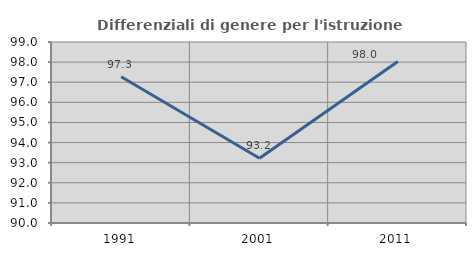
| Category | Differenziali di genere per l'istruzione superiore |
|---|---|
| 1991.0 | 97.273 |
| 2001.0 | 93.216 |
| 2011.0 | 98.034 |